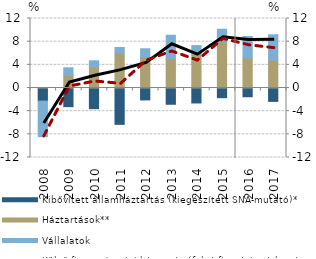
| Category | Kibővített államháztartás (kiegészített SNA-mutató)* | Háztartások** | Vállalatok |
|---|---|---|---|
| 2008.0 | -2.264 | 0.05 | -6.137 |
| 2009.0 | -3.22 | 2.193 | 1.295 |
| 2010.0 | -3.574 | 3.586 | 1.114 |
| 2011.0 | -6.277 | 6.046 | 0.95 |
| 2012.0 | -2.058 | 5.28 | 1.493 |
| 2013.0 | -2.809 | 5.05 | 4.061 |
| 2014.0 | -2.584 | 5.898 | 1.42 |
| 2015.0 | -1.672 | 7.931 | 2.217 |
| 2016.0 | -1.509 | 5.153 | 3.74 |
| 2017.0 | -2.311 | 4.804 | 4.382 |